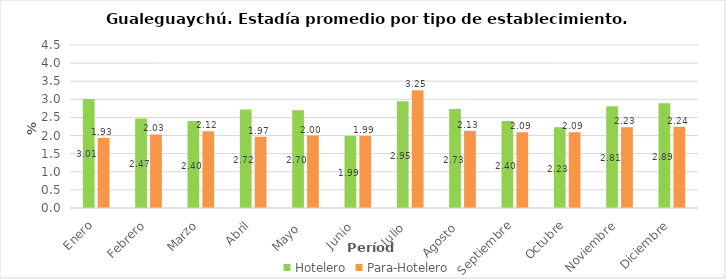
| Category | Hotelero | Para-Hotelero |
|---|---|---|
| Enero | 3.01 | 1.93 |
| Febrero | 2.47 | 2.03 |
| Marzo | 2.4 | 2.12 |
| Abril | 2.72 | 1.97 |
| Mayo  | 2.7 | 2 |
| Junio  | 1.99 | 1.99 |
| Julio  | 2.95 | 3.25 |
| Agosto  | 2.73 | 2.13 |
| Septiembre | 2.4 | 2.09 |
| Octubre | 2.23 | 2.09 |
| Noviembre | 2.81 | 2.23 |
| Diciembre | 2.89 | 2.24 |